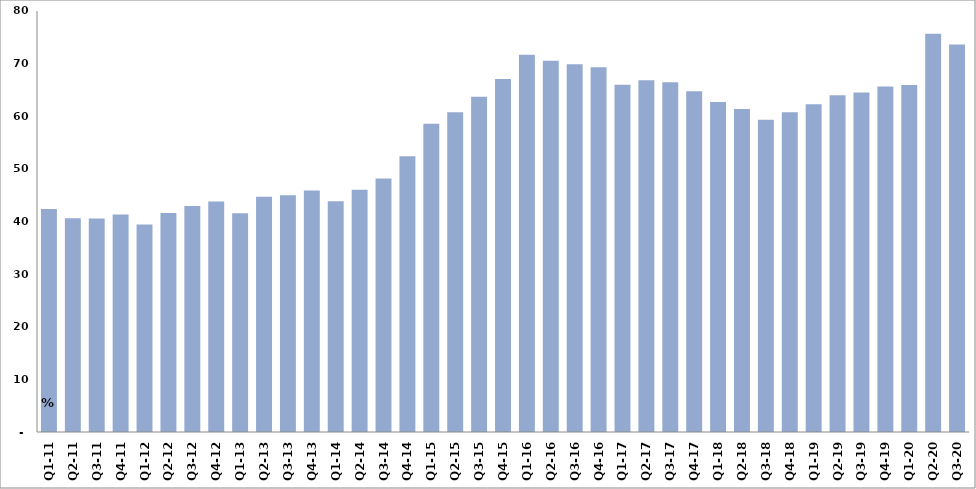
| Category | النسبة المئوية من الناتج المحلي الاجمالي
Percent of Total GDP |
|---|---|
| Q1-11 | 42.369 |
| Q2-11 | 40.601 |
| Q3-11 | 40.547 |
| Q4-11 | 41.329 |
| Q1-12 | 39.44 |
| Q2-12 | 41.604 |
| Q3-12 | 42.962 |
| Q4-12 | 43.796 |
| Q1-13 | 41.576 |
| Q2-13 | 44.693 |
| Q3-13 | 44.994 |
| Q4-13 | 45.912 |
| Q1-14 | 43.837 |
| Q2-14 | 46.044 |
| Q3-14 | 48.189 |
| Q4-14 | 52.383 |
| Q1-15 | 58.582 |
| Q2-15 | 60.762 |
| Q3-15 | 63.715 |
| Q4-15 | 67.099 |
| Q1-16 | 71.666 |
| Q2-16 | 70.553 |
| Q3-16 | 69.87 |
| Q4-16 | 69.293 |
| Q1-17 | 66.009 |
| Q2-17 | 66.843 |
| Q3-17 | 66.464 |
| Q4-17 | 64.772 |
| Q1-18 | 62.723 |
| Q2-18 | 61.368 |
| Q3-18 | 59.342 |
| Q4-18 | 60.743 |
| Q1-19 | 62.283 |
| Q2-19 | 63.973 |
| Q3-19 | 64.493 |
| Q4-19 | 65.67 |
| Q1-20 | 65.932 |
| Q2-20 | 75.674 |
| Q3-20 | 73.642 |